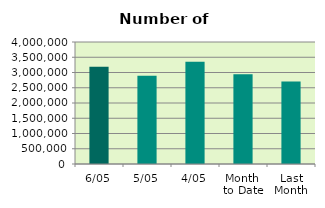
| Category | Series 0 |
|---|---|
| 6/05 | 3189418 |
| 5/05 | 2890118 |
| 4/05 | 3356296 |
| Month 
to Date | 2939954 |
| Last
Month | 2707305.9 |